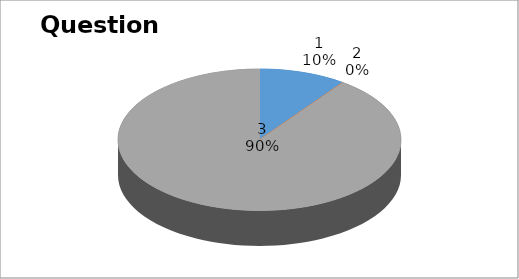
| Category | Series 0 |
|---|---|
| 0 | 1 |
| 1 | 0 |
| 2 | 9 |